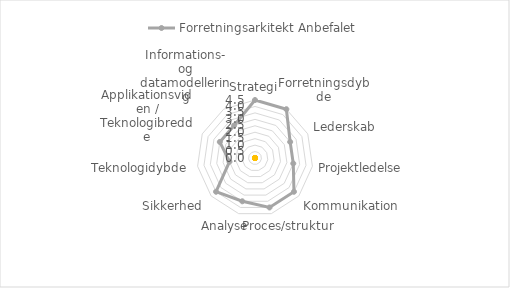
| Category | Forretningsarkitekt |
|---|---|
| Strategi |  |
| Forretningsdybde |  |
| Lederskab |  |
| Projektledelse |  |
| Kommunikation |  |
| Proces/struktur |  |
| Analyse |  |
| Sikkerhed |  |
| Teknologidybde |  |
| Applikationsviden / Teknologibredde |  |
| Informations- og datamodellering |  |